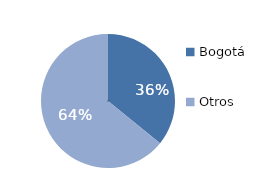
| Category | Series 0 |
|---|---|
| Bogotá | 35.825 |
| Otros | 64.175 |